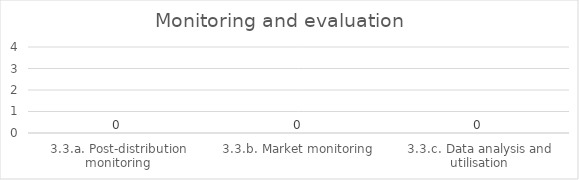
| Category | Monitoring and evaluation |
|---|---|
| 3.3.a. Post-distribution monitoring | 0 |
| 3.3.b. Market monitoring | 0 |
| 3.3.c. Data analysis and utilisation | 0 |